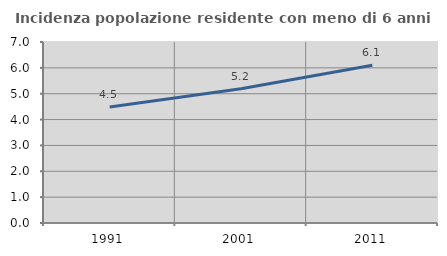
| Category | Incidenza popolazione residente con meno di 6 anni |
|---|---|
| 1991.0 | 4.487 |
| 2001.0 | 5.192 |
| 2011.0 | 6.101 |